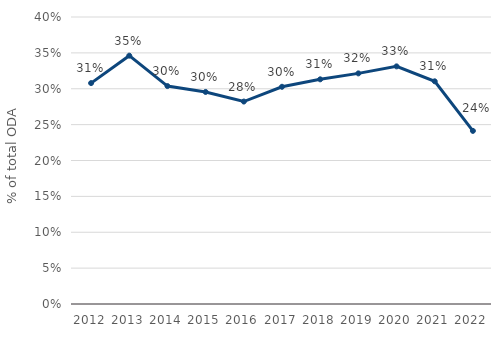
| Category | Series 0 |
|---|---|
| 2012.0 | 0.308 |
| 2013.0 | 0.346 |
| 2014.0 | 0.304 |
| 2015.0 | 0.296 |
| 2016.0 | 0.282 |
| 2017.0 | 0.303 |
| 2018.0 | 0.313 |
| 2019.0 | 0.321 |
| 2020.0 | 0.331 |
| 2021.0 | 0.31 |
| 2022.0 | 0.241 |